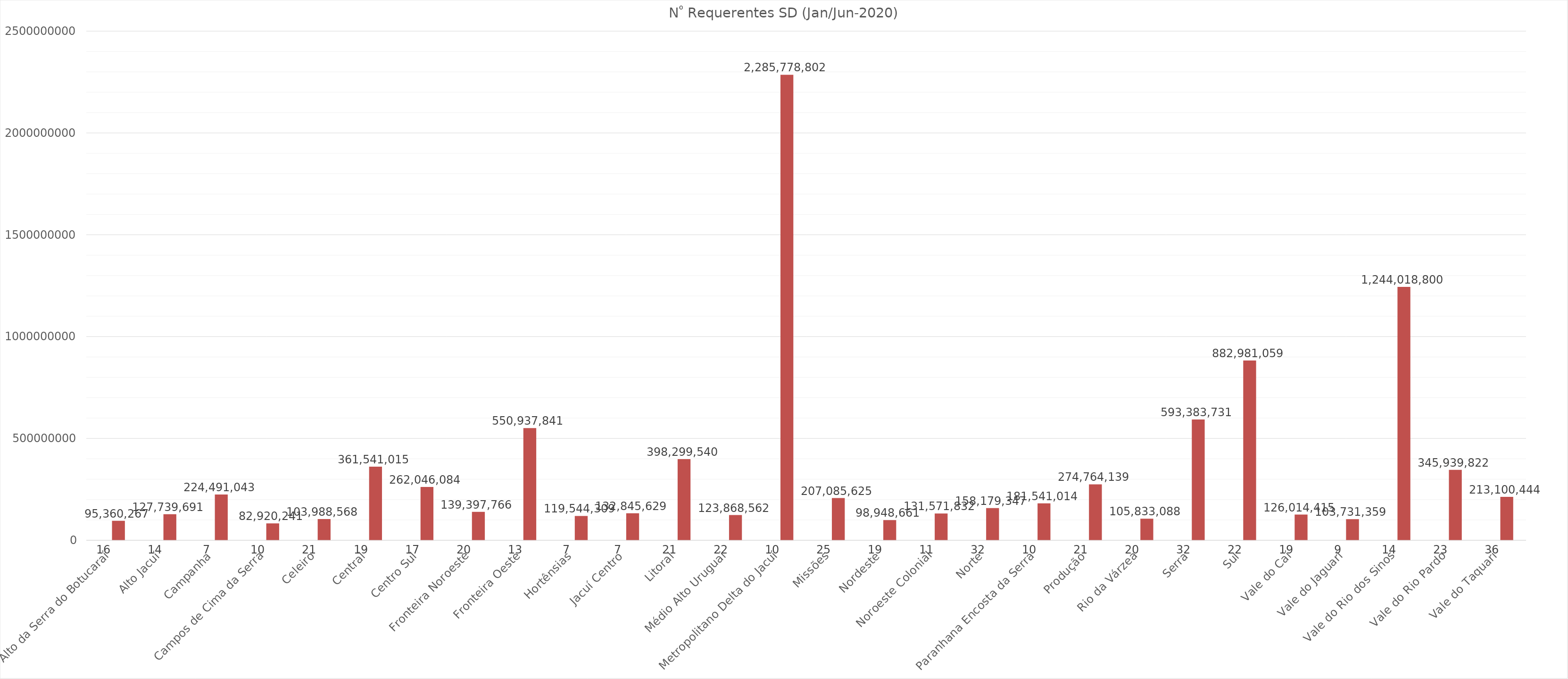
| Category | Quantidade de Municípios | Soma Total |
|---|---|---|
| Alto da Serra do Botucaraí | 16 | 95360267 |
| Alto Jacuí | 14 | 127739691 |
| Campanha | 7 | 224491043 |
| Campos de Cima da Serra | 10 | 82920241 |
| Celeiro | 21 | 103988568 |
| Central | 19 | 361541015 |
| Centro Sul | 17 | 262046084 |
| Fronteira Noroeste | 20 | 139397766 |
| Fronteira Oeste | 13 | 550937841 |
| Hortênsias | 7 | 119544309 |
| Jacuí Centro | 7 | 132845629 |
| Litoral | 21 | 398299540 |
| Médio Alto Uruguai | 22 | 123868562 |
| Metropolitano Delta do Jacuí | 10 | 2285778802 |
| Missões | 25 | 207085625 |
| Nordeste | 19 | 98948661 |
| Noroeste Colonial | 11 | 131571832 |
| Norte | 32 | 158179347 |
| Paranhana Encosta da Serra | 10 | 181541014 |
| Produção | 21 | 274764139 |
| Rio da Várzea | 20 | 105833088 |
| Serra | 32 | 593383731 |
| Sul | 22 | 882981059 |
| Vale do Caí | 19 | 126014415 |
| Vale do Jaguari | 9 | 103731359 |
| Vale do Rio dos Sinos | 14 | 1244018800 |
| Vale do Rio Pardo | 23 | 345939822 |
| Vale do Taquari | 36 | 213100444 |